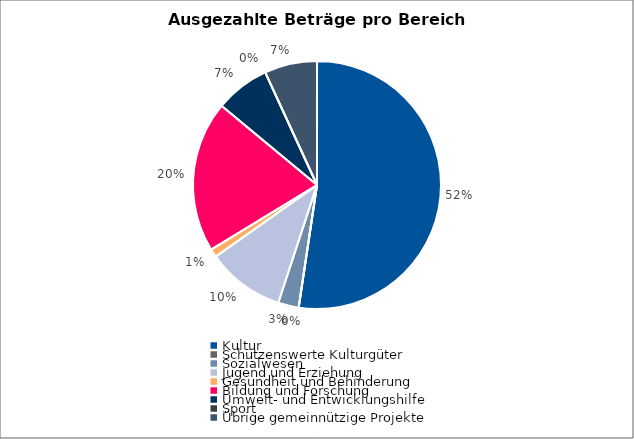
| Category | Series 0 |
|---|---|
| Kultur | 3429491 |
| Schützenswerte Kulturgüter | 0 |
| Sozialwesen | 176000 |
| Jugend und Erziehung | 664900 |
| Gesundheit und Behinderung | 71000 |
| Bildung und Forschung | 1292500 |
| Umwelt- und Entwicklungshilfe | 466357 |
| Sport | 0 |
| Übrige gemeinnützige Projekte | 449500 |